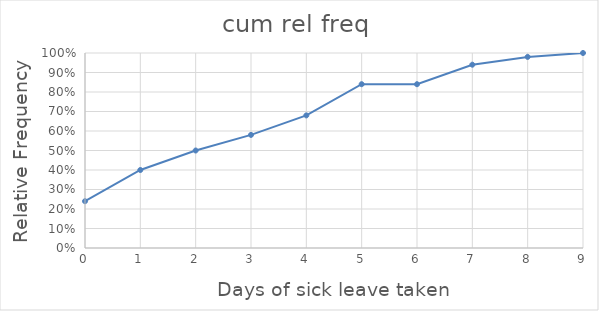
| Category | cum rel |
|---|---|
| 0.0 | 0.24 |
| 1.0 | 0.4 |
| 2.0 | 0.5 |
| 3.0 | 0.58 |
| 4.0 | 0.68 |
| 5.0 | 0.84 |
| 6.0 | 0.84 |
| 7.0 | 0.94 |
| 8.0 | 0.98 |
| 9.0 | 1 |